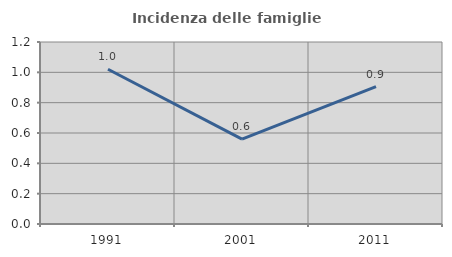
| Category | Incidenza delle famiglie numerose |
|---|---|
| 1991.0 | 1.02 |
| 2001.0 | 0.559 |
| 2011.0 | 0.906 |